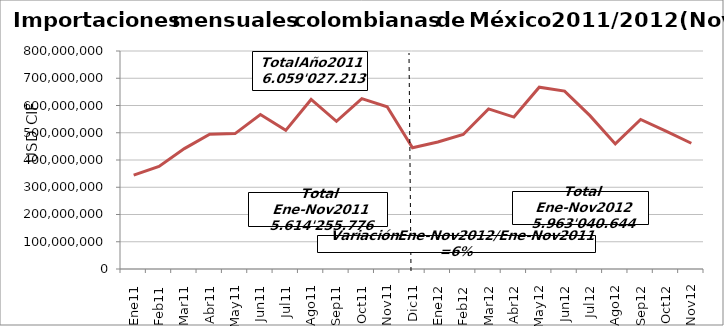
| Category | Series 0 |
|---|---|
| 0 | 344504075.99 |
| 1 | 376178757.71 |
| 2 | 441751986.25 |
| 3 | 494756918.14 |
| 4 | 496852115.07 |
| 5 | 566664396.11 |
| 6 | 508654734.91 |
| 7 | 622292442.58 |
| 8 | 542109322.47 |
| 9 | 625140637.76 |
| 10 | 595350388.98 |
| 11 | 444771437.36 |
| 12 | 466006465.62 |
| 13 | 493587952.36 |
| 14 | 587646115.18 |
| 15 | 557565166.76 |
| 16 | 667304488.51 |
| 17 | 652823805.03 |
| 18 | 562800035.42 |
| 19 | 459129201.2 |
| 20 | 548758280.52 |
| 21 | 505989178.8 |
| 22 | 461429955.01 |